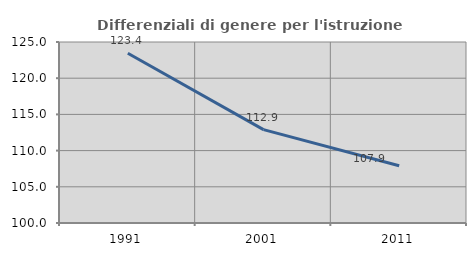
| Category | Differenziali di genere per l'istruzione superiore |
|---|---|
| 1991.0 | 123.444 |
| 2001.0 | 112.904 |
| 2011.0 | 107.912 |